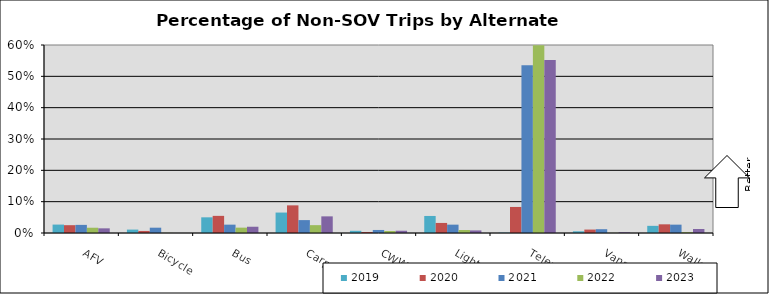
| Category | 2019 | 2020 | 2021 | 2022 | 2023 |
|---|---|---|---|---|---|
| AFV | 0.027 | 0.025 | 0.026 | 0.017 | 0.015 |
| Bicycle | 0.011 | 0.007 | 0.017 | 0 | 0 |
| Bus | 0.05 | 0.055 | 0.027 | 0.017 | 0.02 |
| Carpool | 0.065 | 0.088 | 0.041 | 0.025 | 0.053 |
| CWW | 0.007 | 0.003 | 0.01 | 0.006 | 0.007 |
| Light Rail | 0.054 | 0.032 | 0.027 | 0.009 | 0.008 |
| Telework | 0.001 | 0.083 | 0.535 | 0.599 | 0.552 |
| Vanpool | 0.005 | 0.011 | 0.012 | 0 | 0.002 |
| Walk | 0.023 | 0.028 | 0.027 | 0.002 | 0.013 |